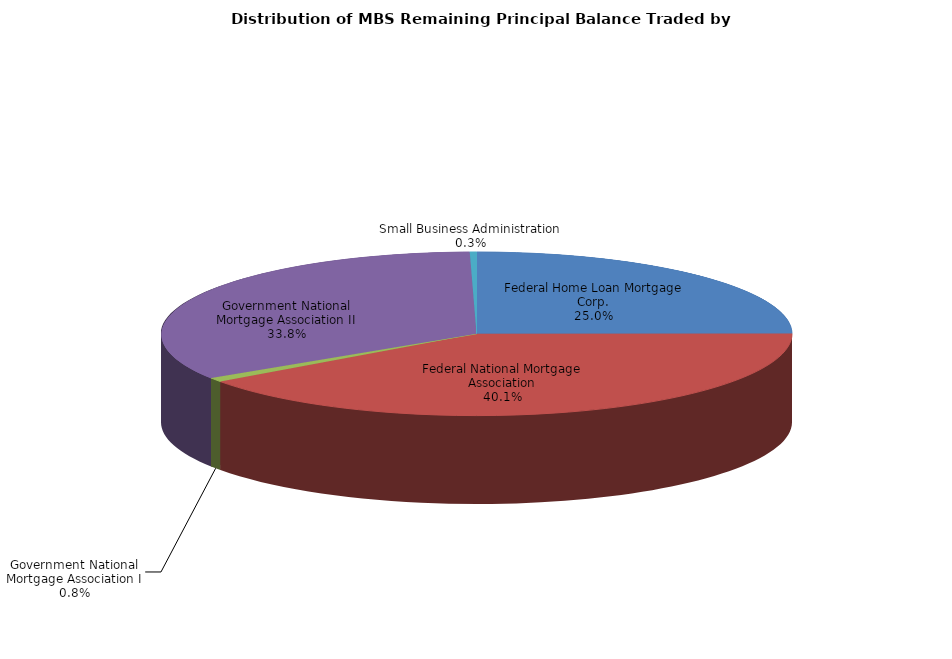
| Category | Series 0 |
|---|---|
| Federal Home Loan Mortgage Corp. | 3512216676.412 |
| Federal National Mortgage Association | 5641697154.432 |
| Government National Mortgage Association I | 117928649.268 |
| Government National Mortgage Association II | 4748156354.487 |
| Small Business Administration | 48150598.348 |